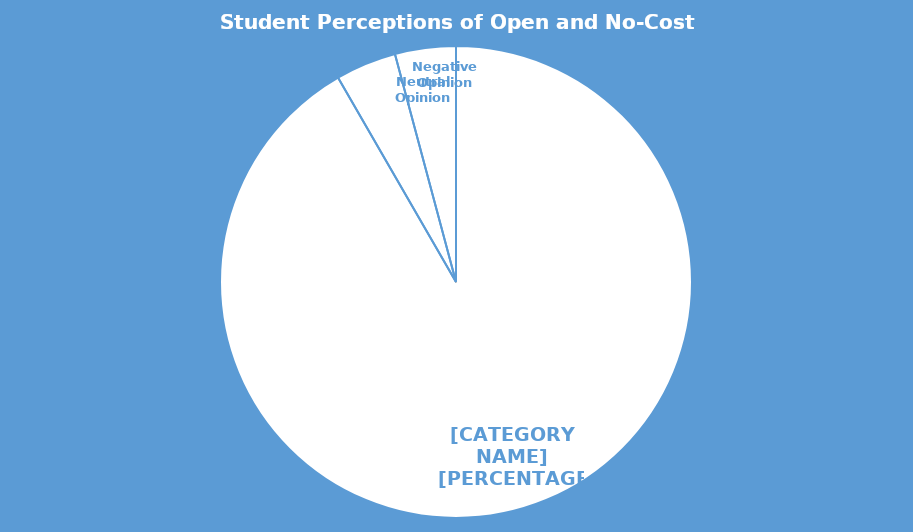
| Category | Series 0 |
|---|---|
| Positive Opinion | 0.917 |
| Neutral Opinion | 0.042 |
| Negative Opinion | 0.042 |